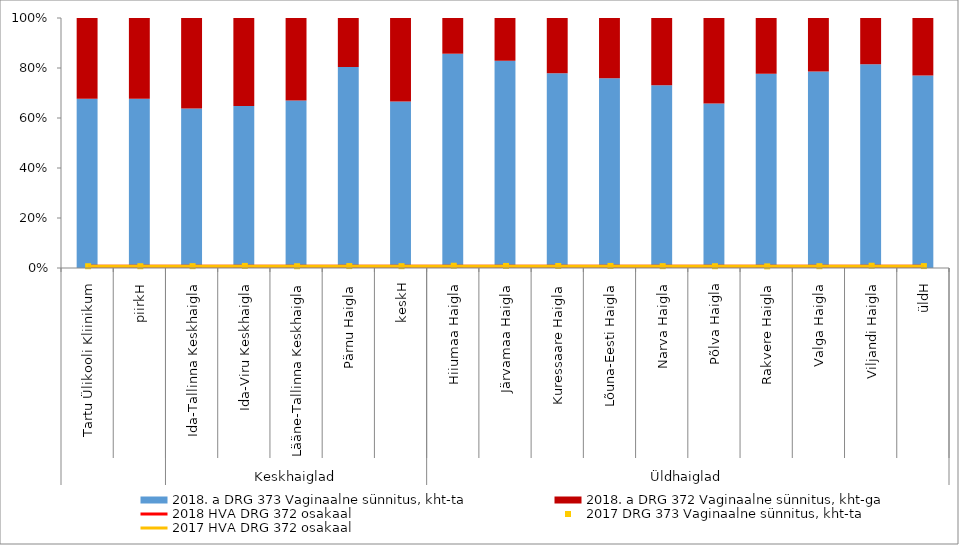
| Category | 2018. a DRG 373 Vaginaalne sünnitus, kht-ta | 2018. a DRG 372 Vaginaalne sünnitus, kht-ga |
|---|---|---|
| 0 | 0.677 | 0.323 |
| 1 | 0.677 | 0.323 |
| 2 | 0.638 | 0.362 |
| 3 | 0.648 | 0.352 |
| 4 | 0.67 | 0.33 |
| 5 | 0.804 | 0.196 |
| 6 | 0.666 | 0.334 |
| 7 | 0.857 | 0.143 |
| 8 | 0.829 | 0.171 |
| 9 | 0.779 | 0.221 |
| 10 | 0.759 | 0.241 |
| 11 | 0.731 | 0.269 |
| 12 | 0.658 | 0.342 |
| 13 | 0.778 | 0.222 |
| 14 | 0.786 | 0.214 |
| 15 | 0.815 | 0.185 |
| 16 | 0.77 | 0.23 |